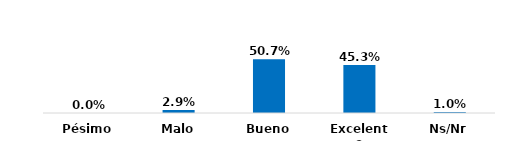
| Category | Series 0 |
|---|---|
| Pésimo | 0 |
| Malo | 0.029 |
| Bueno | 0.507 |
| Excelente | 0.453 |
| Ns/Nr | 0.01 |